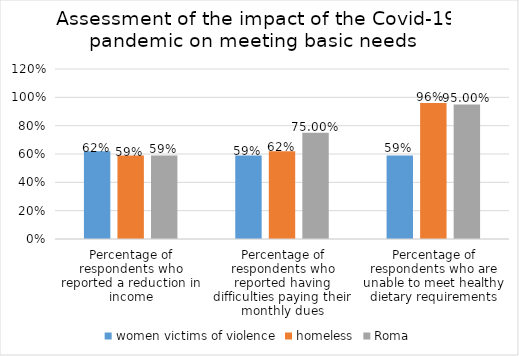
| Category | women victims of violence | homeless | Roma |
|---|---|---|---|
| Percentage of respondents who reported a reduction in income | 0.62 | 0.59 | 0.59 |
| Percentage of respondents who reported having difficulties paying their monthly dues | 0.59 | 0.62 | 0.75 |
| Percentage of respondents who are unable to meet healthy dietary requirements | 0.59 | 0.96 | 0.95 |